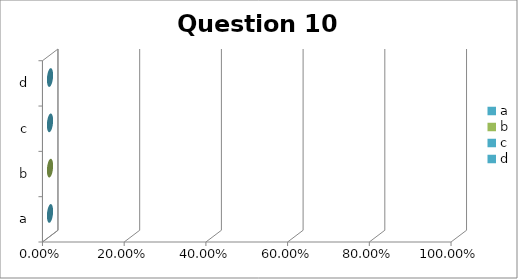
| Category | Overall results for X participants |
|---|---|
| a | 0 |
| b | 0 |
| c | 0 |
| d | 0 |